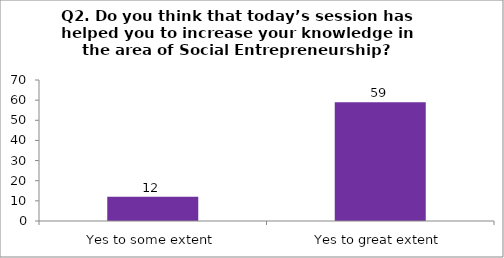
| Category | Q2. Do you think that today’s session has helped you to increase your knowledge in the area of Social Entrepreneurship? |
|---|---|
| Yes to some extent | 12 |
| Yes to great extent | 59 |